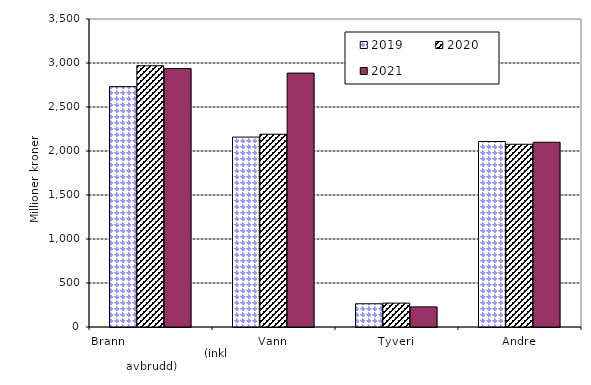
| Category | 2019 | 2020 | 2021 |
|---|---|---|---|
| Brann                                                       (inkl avbrudd) | 2731.245 | 2968.734 | 2936.311 |
| Vann | 2158.059 | 2190.373 | 2885.078 |
| Tyveri | 263.975 | 271.443 | 228.679 |
| Andre | 2107.771 | 2076.654 | 2099.459 |